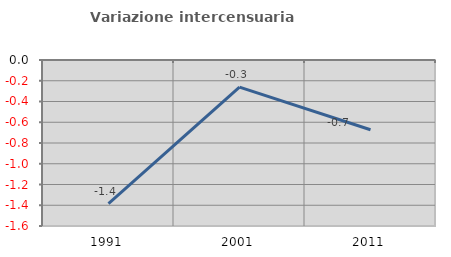
| Category | Variazione intercensuaria annua |
|---|---|
| 1991.0 | -1.383 |
| 2001.0 | -0.261 |
| 2011.0 | -0.673 |